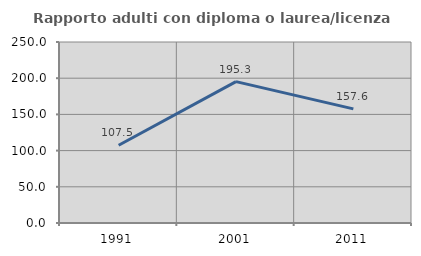
| Category | Rapporto adulti con diploma o laurea/licenza media  |
|---|---|
| 1991.0 | 107.463 |
| 2001.0 | 195.302 |
| 2011.0 | 157.619 |